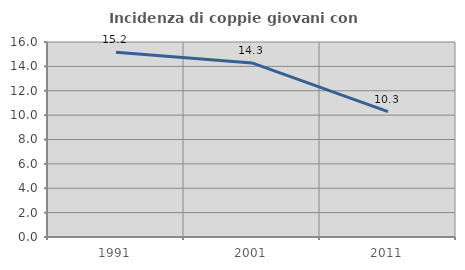
| Category | Incidenza di coppie giovani con figli |
|---|---|
| 1991.0 | 15.164 |
| 2001.0 | 14.286 |
| 2011.0 | 10.28 |